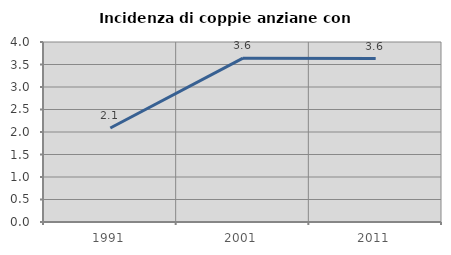
| Category | Incidenza di coppie anziane con figli |
|---|---|
| 1991.0 | 2.089 |
| 2001.0 | 3.641 |
| 2011.0 | 3.632 |